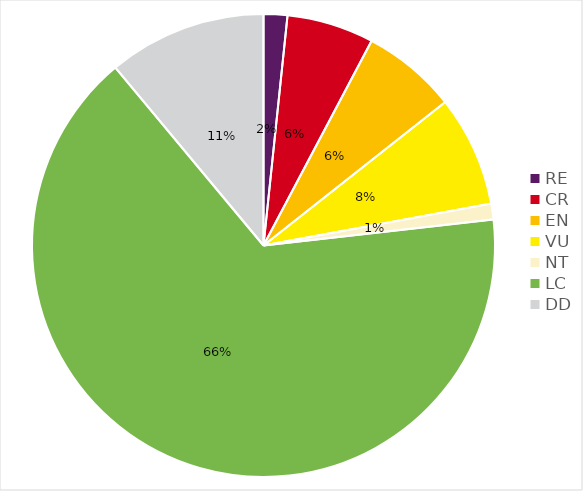
| Category | RE CR EN VU NT LC DD |
|---|---|
| RE | 0.017 |
| CR | 0.061 |
| EN | 0.066 |
| VU | 0.077 |
| NT | 0.011 |
| LC | 0.657 |
| DD | 0.11 |